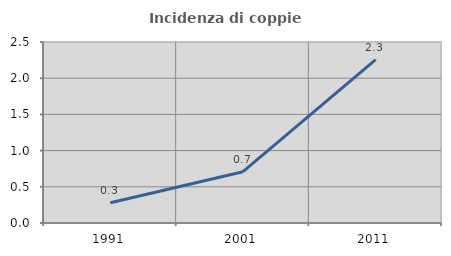
| Category | Incidenza di coppie miste |
|---|---|
| 1991.0 | 0.28 |
| 2001.0 | 0.709 |
| 2011.0 | 2.255 |